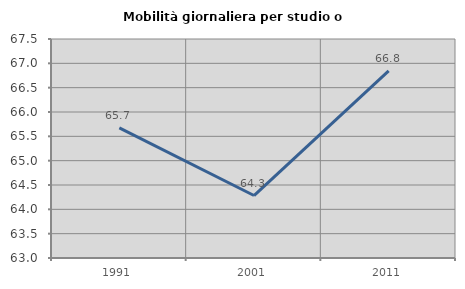
| Category | Mobilità giornaliera per studio o lavoro |
|---|---|
| 1991.0 | 65.673 |
| 2001.0 | 64.284 |
| 2011.0 | 66.844 |